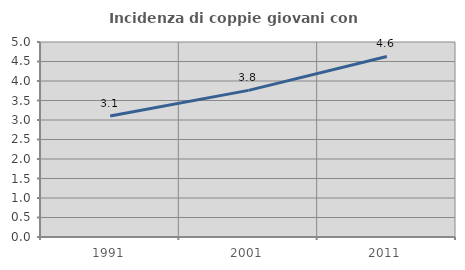
| Category | Incidenza di coppie giovani con figli |
|---|---|
| 1991.0 | 3.101 |
| 2001.0 | 3.759 |
| 2011.0 | 4.63 |